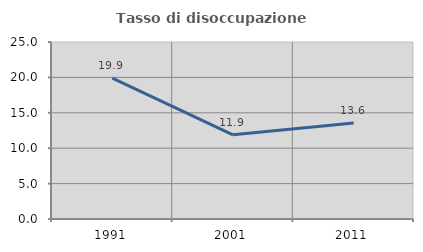
| Category | Tasso di disoccupazione giovanile  |
|---|---|
| 1991.0 | 19.884 |
| 2001.0 | 11.897 |
| 2011.0 | 13.575 |